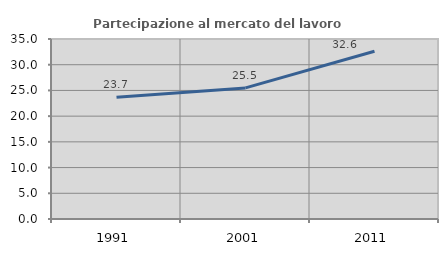
| Category | Partecipazione al mercato del lavoro  femminile |
|---|---|
| 1991.0 | 23.655 |
| 2001.0 | 25.49 |
| 2011.0 | 32.622 |